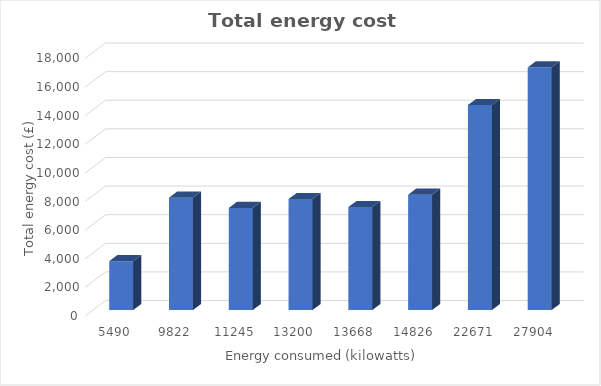
| Category | Total energy cost (£) |
|---|---|
| 5490.0 | 3409.7 |
| 9822.0 | 7857.6 |
| 11245.0 | 7134.55 |
| 13200.0 | 7760 |
| 13668.0 | 7197.32 |
| 14826.0 | 8061.26 |
| 22671.0 | 14329.31 |
| 27904.0 | 16963.36 |